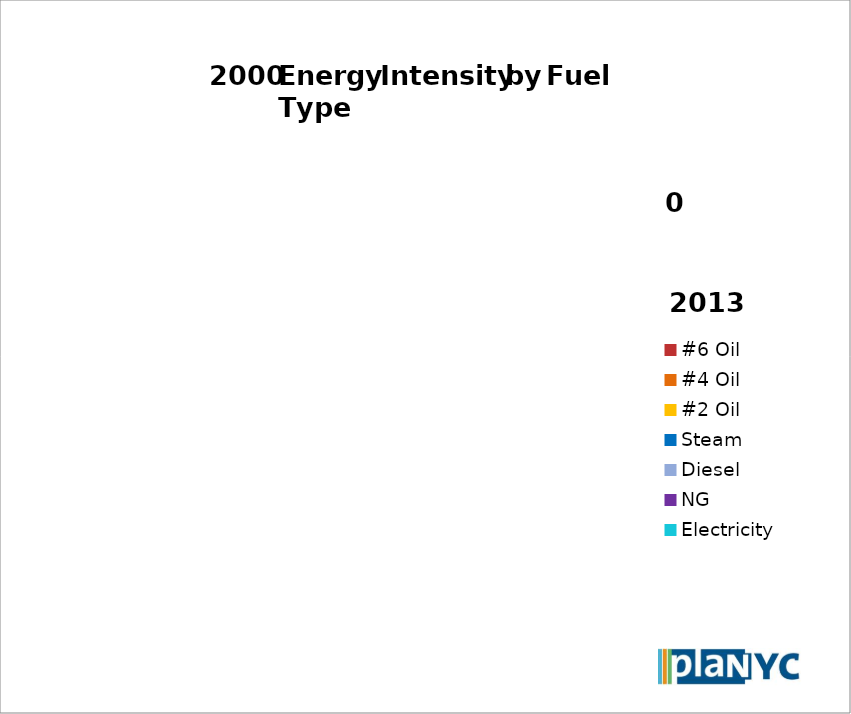
| Category | Series 0 |
|---|---|
| #6 Oil | 0 |
| #4 Oil | 0 |
| #2 Oil | 0 |
| Steam | 0 |
| Diesel | 0 |
| NG | 0 |
| Electricity | 0 |